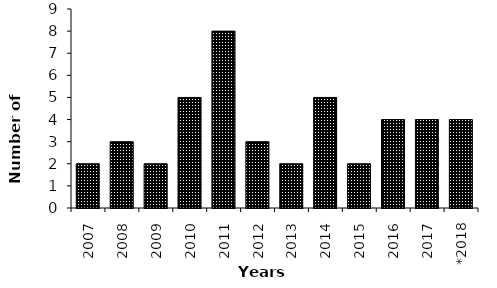
| Category | Nb |
|---|---|
| 2007 | 2 |
| 2008 | 3 |
| 2009 | 2 |
| 2010 | 5 |
| 2011 | 8 |
| 2012 | 3 |
| 2013 | 2 |
| 2014 | 5 |
| 2015 | 2 |
| 2016 | 4 |
| 2017 | 4 |
| *2018 | 4 |